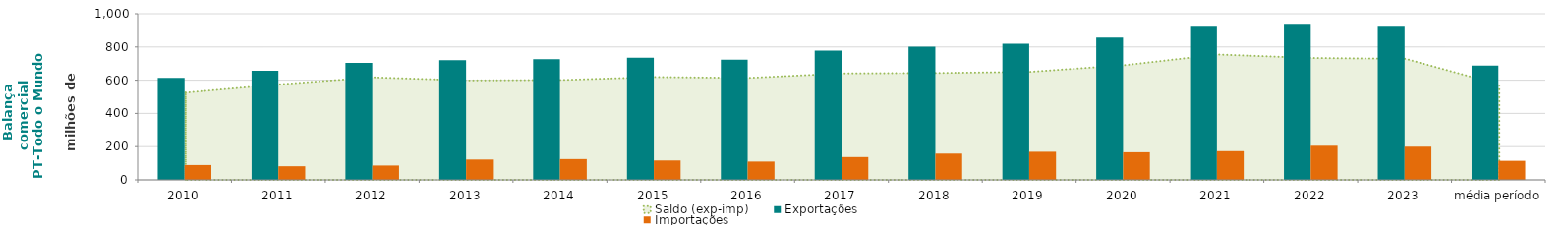
| Category | Exportações  | Importações  |
|---|---|---|
| 2010 | 614.38 | 89.311 |
| 2011 | 656.918 | 81.915 |
| 2012 | 703.505 | 86.371 |
| 2013 | 720.794 | 122.399 |
| 2014 | 726.285 | 125.154 |
| 2015 | 735.534 | 116.755 |
| 2016 | 723.974 | 110.191 |
| 2017 | 778.041 | 137.206 |
| 2018 | 801.217 | 158.104 |
| 2019 | 819.402 | 169.208 |
| 2020 | 856.19 | 166.255 |
| 2021 | 927.437 | 172.866 |
| 2022 | 938.963 | 205.344 |
| 2023 | 928.059 | 199.377 |
| média período | 688.465 | 114.687 |